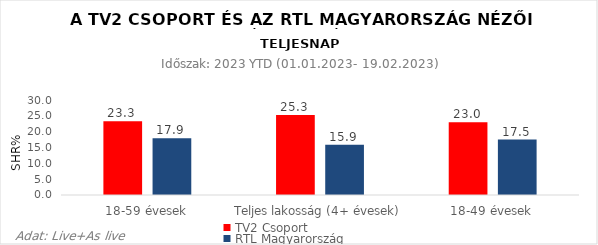
| Category | TV2 Csoport | RTL Magyarország |
|---|---|---|
| 18-59 évesek | 23.3 | 17.9 |
| Teljes lakosság (4+ évesek) | 25.3 | 15.9 |
| 18-49 évesek | 23 | 17.5 |